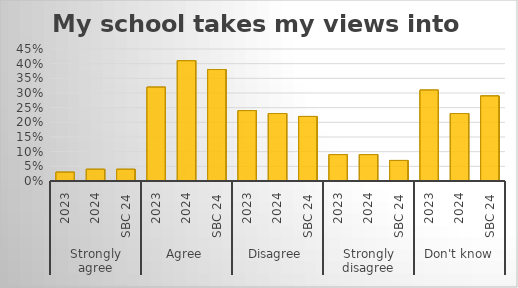
| Category | My school takes my views into account. |
|---|---|
| 0 | 0.03 |
| 1 | 0.04 |
| 2 | 0.04 |
| 3 | 0.32 |
| 4 | 0.41 |
| 5 | 0.38 |
| 6 | 0.24 |
| 7 | 0.23 |
| 8 | 0.22 |
| 9 | 0.09 |
| 10 | 0.09 |
| 11 | 0.07 |
| 12 | 0.31 |
| 13 | 0.23 |
| 14 | 0.29 |